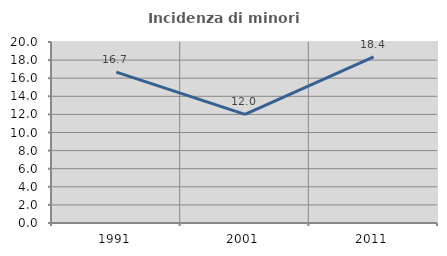
| Category | Incidenza di minori stranieri |
|---|---|
| 1991.0 | 16.667 |
| 2001.0 | 12 |
| 2011.0 | 18.367 |